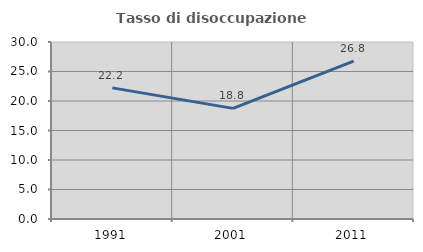
| Category | Tasso di disoccupazione giovanile  |
|---|---|
| 1991.0 | 22.222 |
| 2001.0 | 18.75 |
| 2011.0 | 26.761 |